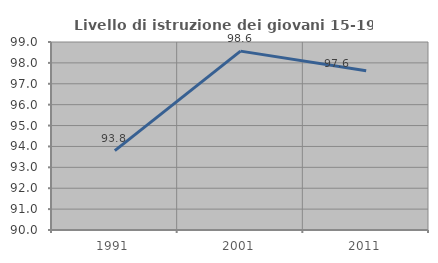
| Category | Livello di istruzione dei giovani 15-19 anni |
|---|---|
| 1991.0 | 93.802 |
| 2001.0 | 98.563 |
| 2011.0 | 97.619 |